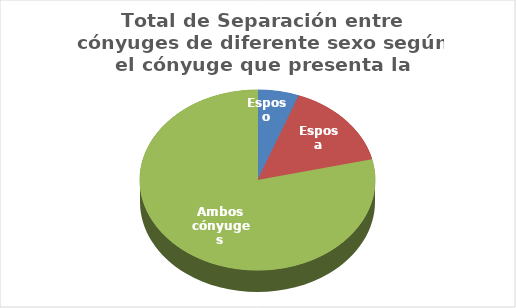
| Category | Series 0 |
|---|---|
| Esposo | 205 |
| Esposa | 563 |
| Ambos cónyuges | 2839 |